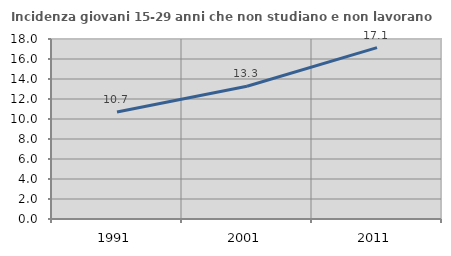
| Category | Incidenza giovani 15-29 anni che non studiano e non lavorano  |
|---|---|
| 1991.0 | 10.704 |
| 2001.0 | 13.278 |
| 2011.0 | 17.135 |